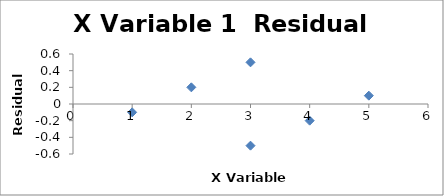
| Category | Series 0 |
|---|---|
| 1.0 | -0.1 |
| 2.0 | 0.2 |
| 3.0 | -0.5 |
| 3.0 | 0.5 |
| 4.0 | -0.2 |
| 5.0 | 0.1 |